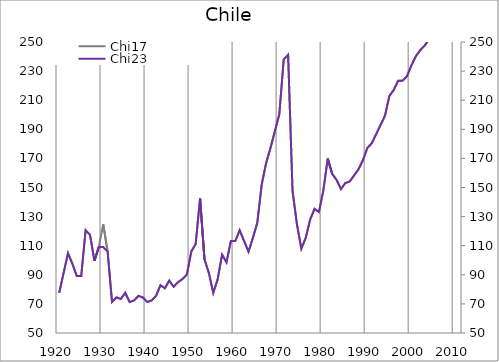
| Category | Chi17 |
|---|---|
| 1920.0 | 77.605 |
| 1921.0 | 91.238 |
| 1922.0 | 104.872 |
| 1923.0 | 97.531 |
| 1924.0 | 89.141 |
| 1925.0 | 89.141 |
| 1926.0 | 120.602 |
| 1927.0 | 117.456 |
| 1928.0 | 99.628 |
| 1929.0 | 109.066 |
| 1930.0 | 124.797 |
| 1931.0 | 105.92 |
| 1932.0 | 71.313 |
| 1933.0 | 74.459 |
| 1934.0 | 73.41 |
| 1935.0 | 77.605 |
| 1936.0 | 71.313 |
| 1937.0 | 72.361 |
| 1938.0 | 75.508 |
| 1939.0 | 74.459 |
| 1940.0 | 71.313 |
| 1941.0 | 72.361 |
| 1942.0 | 75.508 |
| 1943.0 | 82.849 |
| 1944.0 | 80.751 |
| 1945.0 | 85.995 |
| 1946.0 | 81.8 |
| 1947.0 | 84.946 |
| 1948.0 | 87.043 |
| 1949.0 | 90.19 |
| 1950.0 | 105.92 |
| 1951.0 | 111.164 |
| 1952.0 | 142.625 |
| 1953.0 | 100.677 |
| 1954.0 | 91.238 |
| 1955.0 | 77.605 |
| 1956.0 | 87.043 |
| 1957.0 | 103.823 |
| 1958.0 | 98.579 |
| 1959.0 | 113.261 |
| 1960.0 | 113.261 |
| 1961.0 | 120.602 |
| 1962.0 | 113.261 |
| 1963.0 | 105.92 |
| 1964.0 | 115.359 |
| 1965.0 | 125.846 |
| 1966.0 | 152.064 |
| 1967.0 | 166.746 |
| 1968.0 | 177.233 |
| 1969.0 | 188.769 |
| 1970.0 | 200.305 |
| 1971.0 | 238.059 |
| 1972.0 | 241.205 |
| 1973.0 | 147.869 |
| 1974.0 | 124.797 |
| 1975.0 | 108.018 |
| 1976.0 | 115.359 |
| 1977.0 | 127.943 |
| 1978.0 | 135.284 |
| 1979.0 | 133.187 |
| 1980.0 | 147.869 |
| 1981.0 | 169.892 |
| 1982.0 | 159.405 |
| 1983.0 | 155.21 |
| 1984.0 | 148.918 |
| 1985.0 | 153.113 |
| 1986.0 | 154.161 |
| 1987.0 | 158.356 |
| 1988.0 | 162.551 |
| 1989.0 | 168.843 |
| 1990.0 | 177.233 |
| 1991.0 | 180.379 |
| 1992.0 | 186.671 |
| 1993.0 | 192.964 |
| 1994.0 | 199.256 |
| 1995.0 | 212.889 |
| 1996.0 | 217.084 |
| 1997.0 | 223.377 |
| 1998.0 | 223.377 |
| 1999.0 | 226.523 |
| 2000.0 | 233.864 |
| 2001.0 | 240.156 |
| 2002.0 | 244.351 |
| 2003.0 | 247.497 |
| 2004.0 | 251.692 |
| 2005.0 | 261.13 |
| 2006.0 | 270.569 |
| 2007.0 | 275.812 |
| 2008.0 | 276.861 |
| 2009.0 | 293.641 |
| 2010.0 | 299.084 |
| 2011.0 | 304.629 |